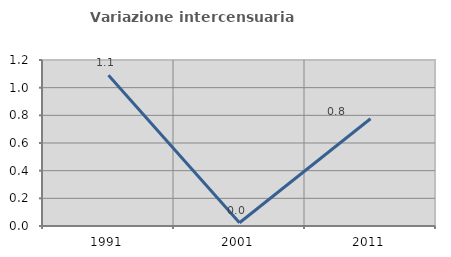
| Category | Variazione intercensuaria annua |
|---|---|
| 1991.0 | 1.089 |
| 2001.0 | 0.023 |
| 2011.0 | 0.775 |